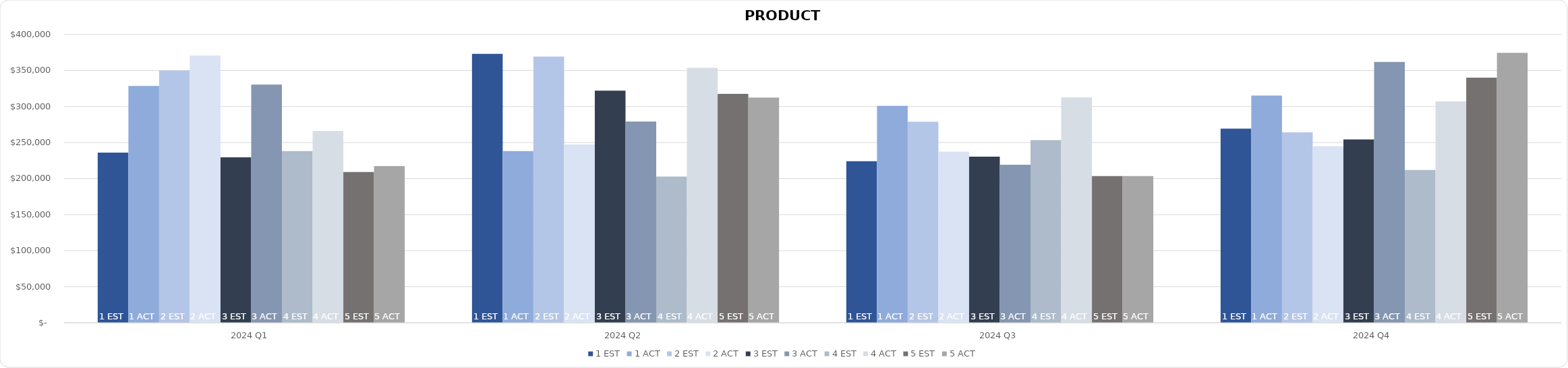
| Category | 1 | 2 | 3 | 4 | 5 |
|---|---|---|---|---|---|
| 2024 Q1 | 328554 | 370834 | 330368 | 266070 | 217289 |
| 2024 Q2 | 238136 | 247324 | 279114 | 353563 | 312312 |
| 2024 Q3 | 300822 | 237385 | 219257 | 312586 | 203487 |
| 2024 Q4 | 315337 | 245048 | 361880 | 306970 | 374445 |